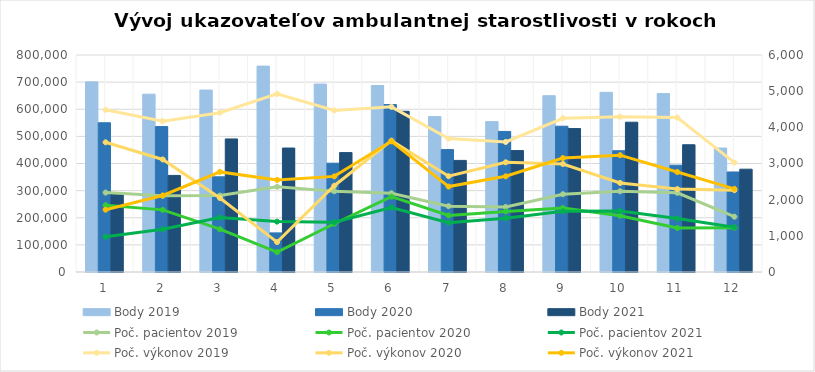
| Category | Body 2019 | Body 2020 | Body 2021 |
|---|---|---|---|
| 0 | 700975 | 550200 | 290360 |
| 1 | 655610 | 536230 | 356080 |
| 2 | 670765 | 350945 | 490510 |
| 3 | 758990 | 144150 | 457025 |
| 4 | 692805 | 401120 | 440205 |
| 5 | 687660 | 617205 | 592510 |
| 6 | 572915 | 451284 | 411440 |
| 7 | 554515 | 518185 | 447585 |
| 8 | 650040 | 537496 | 528760 |
| 9 | 662365 | 447020 | 552190 |
| 10 | 657715 | 393825 | 469175 |
| 11 | 457010 | 368815 | 378980 |